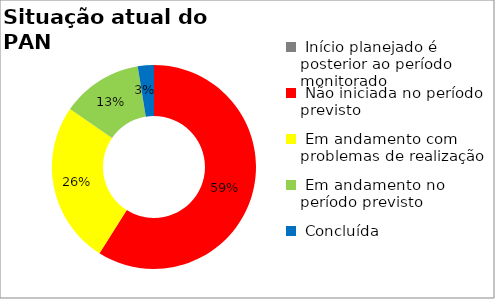
| Category | Series 0 |
|---|---|
|  Início planejado é posterior ao período monitorado | 0 |
|  Não iniciada no período previsto | 0.59 |
|  Em andamento com problemas de realização | 0.256 |
|  Em andamento no período previsto  | 0.128 |
|  Concluída | 0.026 |